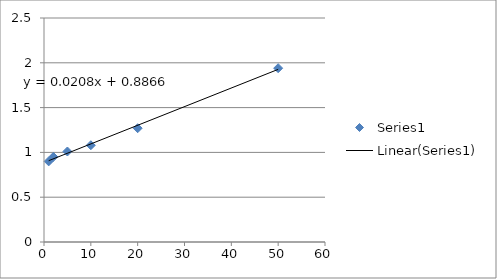
| Category | Series 0 |
|---|---|
| 1.0 | 0.9 |
| 2.0 | 0.95 |
| 5.0 | 1.01 |
| 10.0 | 1.08 |
| 20.0 | 1.27 |
| 50.0 | 1.94 |